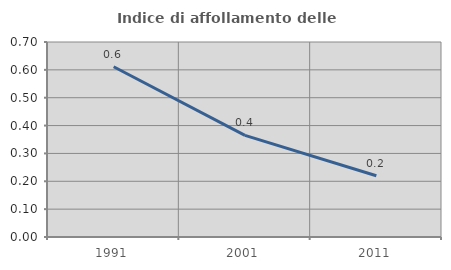
| Category | Indice di affollamento delle abitazioni  |
|---|---|
| 1991.0 | 0.611 |
| 2001.0 | 0.365 |
| 2011.0 | 0.22 |